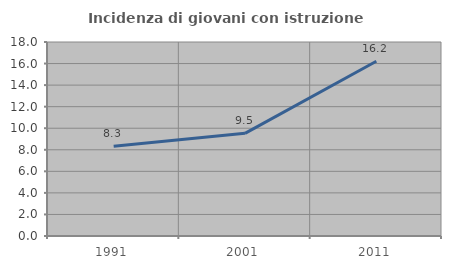
| Category | Incidenza di giovani con istruzione universitaria |
|---|---|
| 1991.0 | 8.333 |
| 2001.0 | 9.524 |
| 2011.0 | 16.216 |